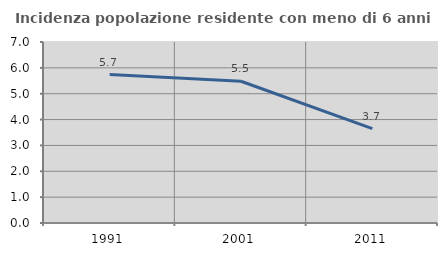
| Category | Incidenza popolazione residente con meno di 6 anni |
|---|---|
| 1991.0 | 5.738 |
| 2001.0 | 5.482 |
| 2011.0 | 3.652 |